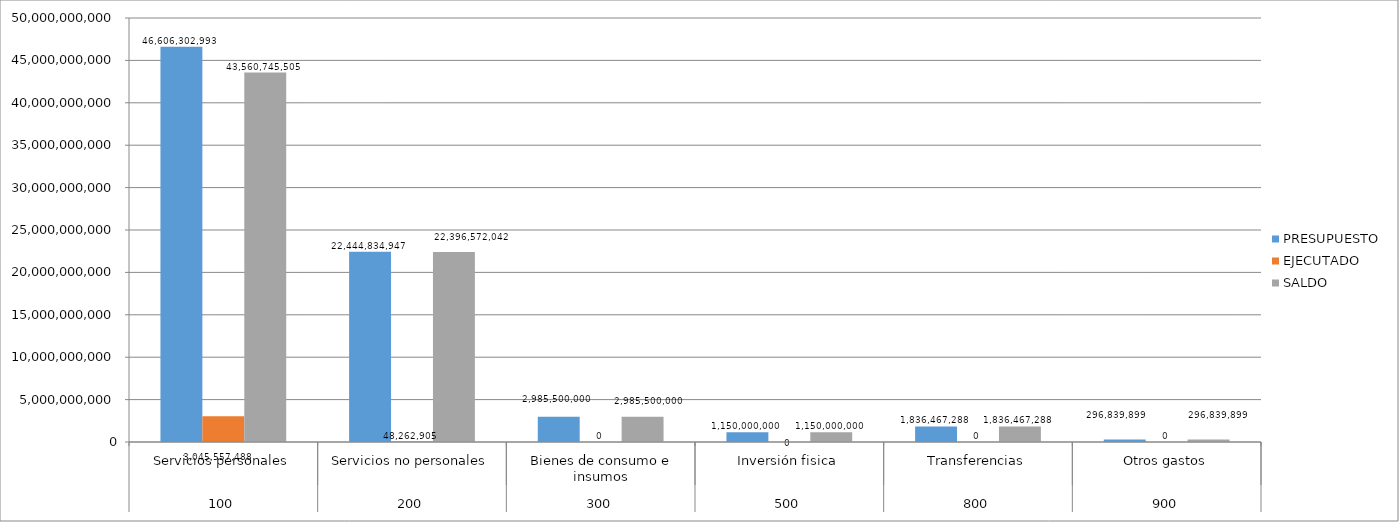
| Category | PRESUPUESTO | EJECUTADO | SALDO |
|---|---|---|---|
| 0 | 46606302993 | 3045557488 | 43560745505 |
| 1 | 22444834947 | 48262905 | 22396572042 |
| 2 | 2985500000 | 0 | 2985500000 |
| 3 | 1150000000 | 0 | 1150000000 |
| 4 | 1836467288 | 0 | 1836467288 |
| 5 | 296839899 | 0 | 296839899 |